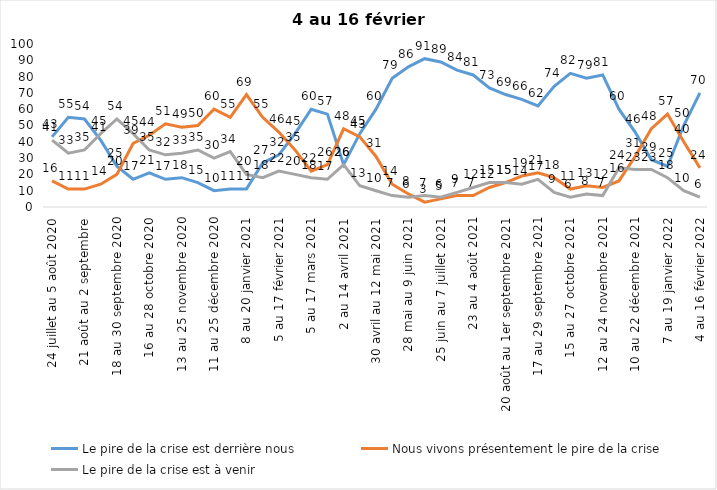
| Category | Le pire de la crise est derrière nous | Nous vivons présentement le pire de la crise | Le pire de la crise est à venir |
|---|---|---|---|
| 24 juillet au 5 août 2020 | 43 | 16 | 41 |
| 7 au 19 août 2020 | 55 | 11 | 33 |
| 21 août au 2 septembre | 54 | 11 | 35 |
| 4 au 16 septembre 2020 | 41 | 14 | 45 |
| 18 au 30 septembre 2020 | 25 | 20 | 54 |
| 2 au 14 octobre 2020 | 17 | 39 | 45 |
| 16 au 28 octobre 2020 | 21 | 44 | 35 |
| 30 octobre au 11 novembre 2020 | 17 | 51 | 32 |
| 13 au 25 novembre 2020 | 18 | 49 | 33 |
| 27 au 9 décembre 2020 | 15 | 50 | 35 |
| 11 au 25 décembre 2020 | 10 | 60 | 30 |
| 25 décembre 2020 au 6 janvier  2021 | 11 | 55 | 34 |
| 8 au 20 janvier 2021 | 11 | 69 | 20 |
| 22 janvier au 3 février 2021 | 27 | 55 | 18 |
| 5 au 17 février 2021 | 32 | 46 | 22 |
| 19 février au 3 mars 2021 | 45 | 35 | 20 |
| 5 au 17 mars 2021 | 60 | 22 | 18 |
| 19 au 31 mars 2021 | 57 | 26 | 17 |
| 2 au 14 avril 2021 | 26 | 48 | 26 |
| 16 au 28 avril 2021 | 45 | 43 | 13 |
| 30 avril au 12 mai 2021 | 60 | 31 | 10 |
| 14 au 26 mai 2021 | 79 | 14 | 7 |
| 28 mai au 9 juin 2021 | 86 | 8 | 6 |
| 11 au 23 juin 2021 | 91 | 3 | 7 |
| 25 juin au 7 juillet 2021 | 89 | 5 | 6 |
| 9 au 21 juillet 2021 | 84 | 7 | 9 |
| 23 au 4 août 2021 | 81 | 7 | 12 |
| 6 au 18 août 2021 | 73 | 12 | 15 |
| 20 août au 1er septembre 2021 | 69 | 15 | 15 |
| 3 au 15 septembre 2021 | 66 | 19 | 14 |
| 17 au 29 septembre 2021 | 62 | 21 | 17 |
| 1 au 13 octobre 2021 | 74 | 18 | 9 |
| 15 au 27 octobre 2021 | 82 | 11 | 6 |
| 29 octobre au 10 novembre 2021 | 79 | 13 | 8 |
| 12 au 24 novembre 2021 | 81 | 12 | 7 |
| 26 novembre au 8 décembre 2021 | 60 | 16 | 24 |
| 10 au 22 décembre 2021 | 46 | 31 | 23 |
| 24 décembre 2021 au 5 janvier 2022 | 29 | 48 | 23 |
| 7 au 19 janvier 2022 | 25 | 57 | 18 |
| 21 janvier au 2 février 2022 | 50 | 40 | 10 |
| 4 au 16 février 2022 | 70 | 24 | 6 |